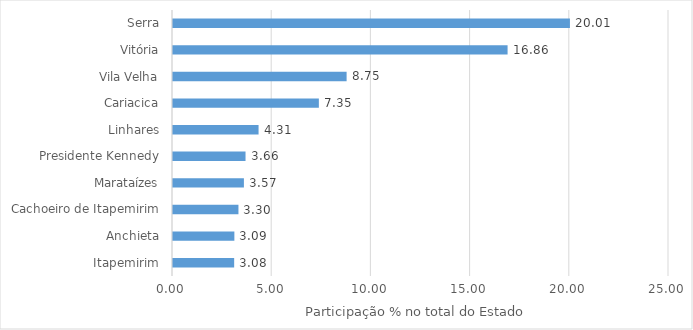
| Category | Series 0 |
|---|---|
| Itapemirim | 3.083 |
| Anchieta | 3.093 |
| Cachoeiro de Itapemirim | 3.299 |
| Marataízes | 3.574 |
| Presidente Kennedy | 3.656 |
| Linhares | 4.313 |
| Cariacica | 7.352 |
| Vila Velha | 8.751 |
| Vitória | 16.864 |
| Serra | 20.006 |